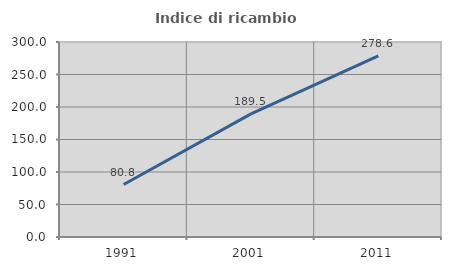
| Category | Indice di ricambio occupazionale  |
|---|---|
| 1991.0 | 80.769 |
| 2001.0 | 189.474 |
| 2011.0 | 278.571 |